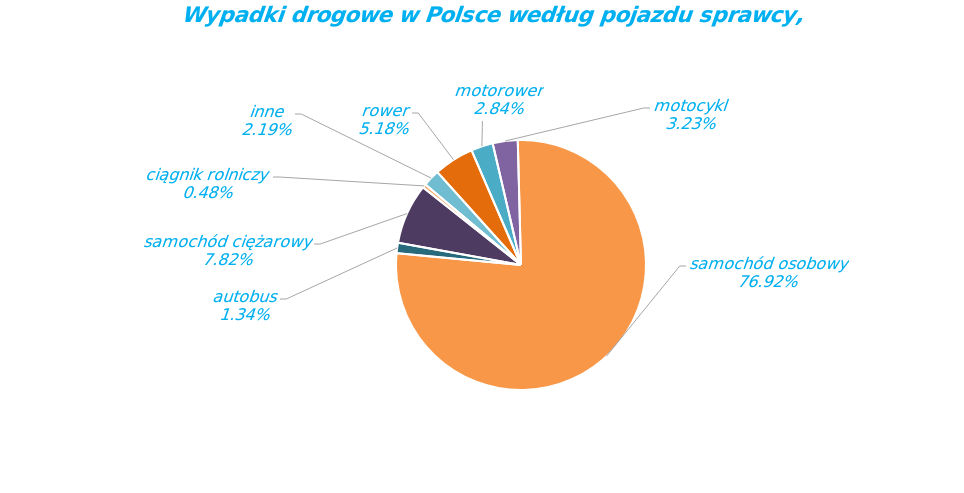
| Category | Series 0 |
|---|---|
| rower | 1588 |
| motorower | 869 |
| motocykl | 990 |
| samochód osobowy | 23559 |
| autobus | 410 |
| samochód ciężarowy | 2394 |
| ciągnik rolniczy | 146 |
| inne | 672 |